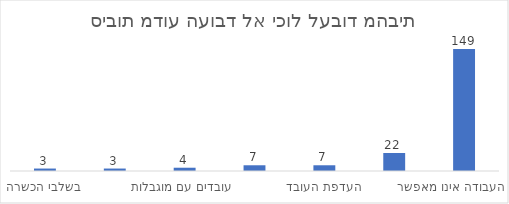
| Category | סה"כ |
|---|---|
| אופי העבודה אינו מאפשר | 149 |
| היעדר מחשב נייד משרדי | 22 |
| העדפת העובד | 7 |
| היעדר ציוד משרדי תומך | 7 |
| עובדים עם מוגבלות  | 4 |
| היעדר אינטרנט | 3 |
| בשלבי הכשרה | 3 |